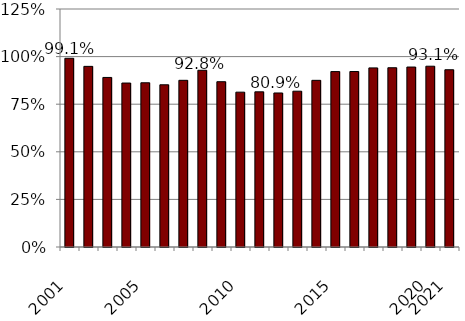
| Category | Series 0 |
|---|---|
| 2001.0 | 0.991 |
| nan | 0.949 |
| nan | 0.89 |
| nan | 0.861 |
| 2005.0 | 0.863 |
| nan | 0.852 |
| nan | 0.875 |
| nan | 0.928 |
| nan | 0.868 |
| 2010.0 | 0.813 |
| nan | 0.815 |
| nan | 0.809 |
| nan | 0.818 |
| nan | 0.875 |
| 2015.0 | 0.921 |
| nan | 0.922 |
| nan | 0.941 |
| nan | 0.941 |
| nan | 0.945 |
| 2020.0 | 0.95 |
| 2021.0 | 0.931 |